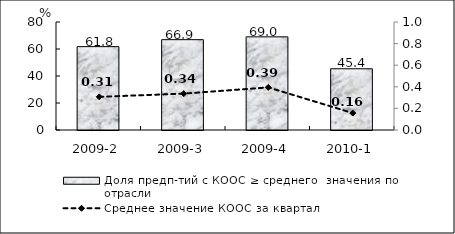
| Category | Доля предп-тий с КООС ≥ среднего  значения по отрасли |
|---|---|
| 2009-2 | 61.75 |
| 2009-3 | 66.92 |
| 2009-4 | 69 |
| 2010-1 | 45.35 |